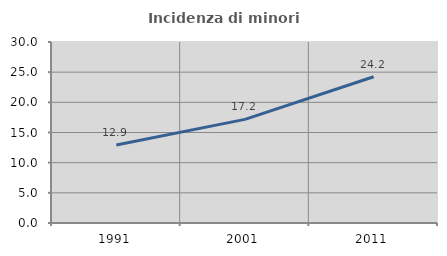
| Category | Incidenza di minori stranieri |
|---|---|
| 1991.0 | 12.931 |
| 2001.0 | 17.176 |
| 2011.0 | 24.239 |